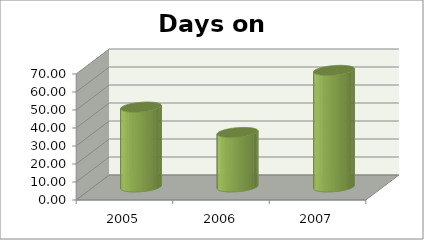
| Category | Days on Market |
|---|---|
| 2005.0 | 44.4 |
| 2006.0 | 30.3 |
| 2007.0 | 64.8 |